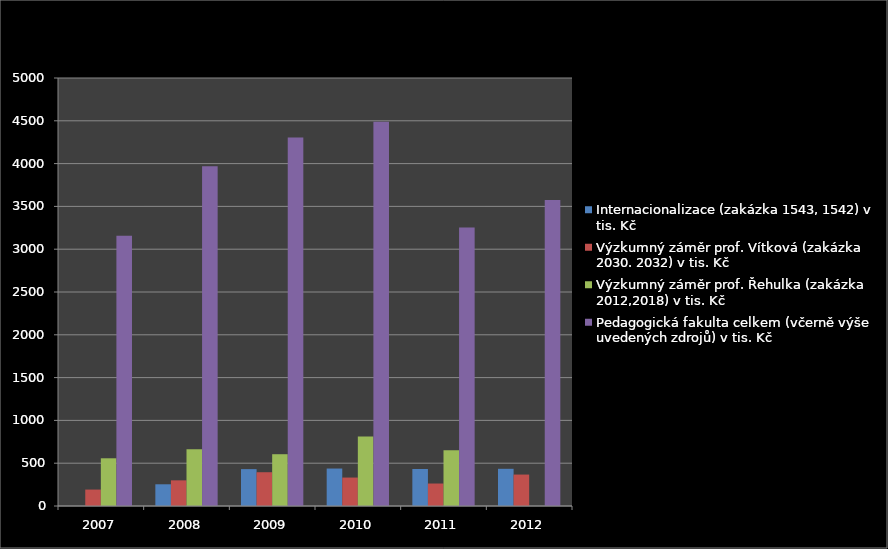
| Category | Internacionalizace (zakázka 1543, 1542) v tis. Kč | Výzkumný záměr prof. Vítková (zakázka 2030. 2032) v tis. Kč | Výzkumný záměr prof. Řehulka (zakázka 2012,2018) v tis. Kč | Pedagogická fakulta celkem (včerně výše uvedených zdrojů) v tis. Kč |
|---|---|---|---|---|
| 2007.0 | 0 | 191.935 | 557.449 | 3156.82 |
| 2008.0 | 253.654 | 299.723 | 662.841 | 3969.797 |
| 2009.0 | 430.762 | 394.611 | 605.024 | 4304.547 |
| 2010.0 | 437.644 | 332.194 | 812.885 | 4488.989 |
| 2011.0 | 432.109 | 262.548 | 651.146 | 3253.199 |
| 2012.0 | 434.514 | 367.21 | 0 | 3575.309 |